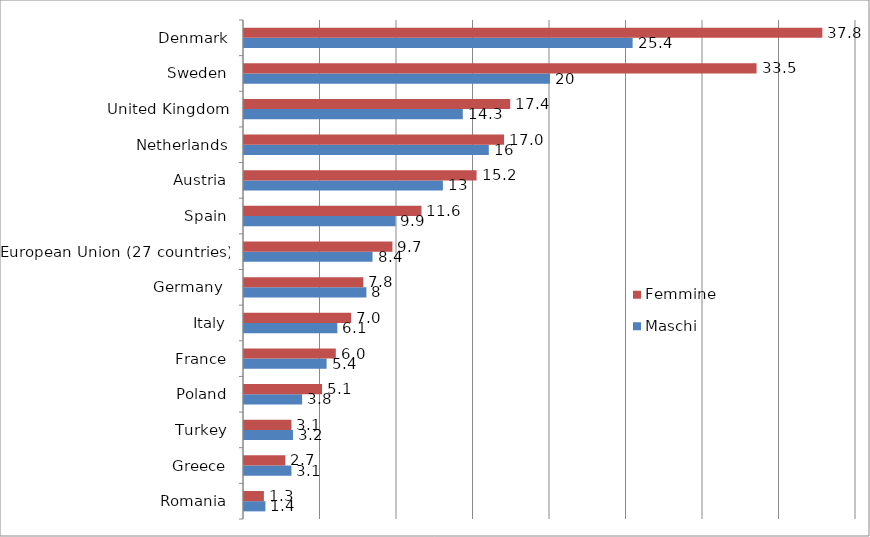
| Category | Maschi | Femmine |
|---|---|---|
| Romania | 1.4 | 1.3 |
| Greece | 3.1 | 2.7 |
| Turkey | 3.2 | 3.1 |
| Poland | 3.8 | 5.1 |
| France | 5.4 | 6 |
| Italy | 6.1 | 7 |
| Germany  | 8 | 7.8 |
| European Union (27 countries) | 8.4 | 9.7 |
| Spain | 9.9 | 11.6 |
| Austria | 13 | 15.2 |
| Netherlands | 16 | 17 |
| United Kingdom | 14.3 | 17.4 |
| Sweden | 20 | 33.5 |
| Denmark | 25.4 | 37.8 |